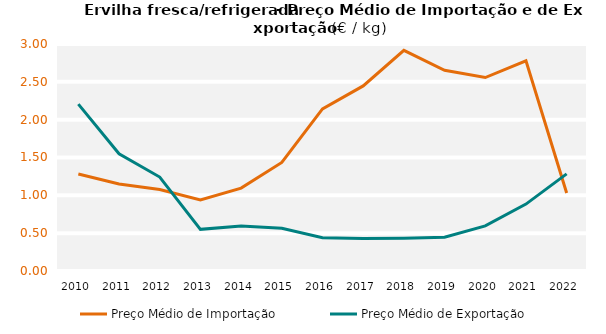
| Category | Preço Médio de Importação | Preço Médio de Exportação |
|---|---|---|
| 2010.0 | 1.282 | 2.205 |
| 2011.0 | 1.149 | 1.55 |
| 2012.0 | 1.077 | 1.242 |
| 2013.0 | 0.94 | 0.551 |
| 2014.0 | 1.095 | 0.596 |
| 2015.0 | 1.435 | 0.565 |
| 2016.0 | 2.142 | 0.44 |
| 2017.0 | 2.446 | 0.429 |
| 2018.0 | 2.916 | 0.434 |
| 2019.0 | 2.653 | 0.447 |
| 2020.0 | 2.557 | 0.596 |
| 2021.0 | 2.778 | 0.884 |
| 2022.0 | 1.03 | 1.284 |